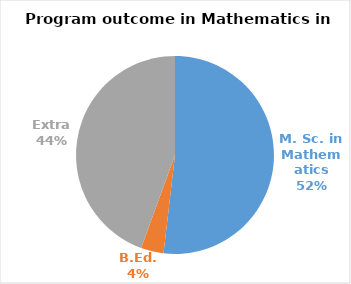
| Category | Series 0 |
|---|---|
| M. Sc. in Mathematics | 14 |
| B.Ed. | 1 |
| Extra | 12 |